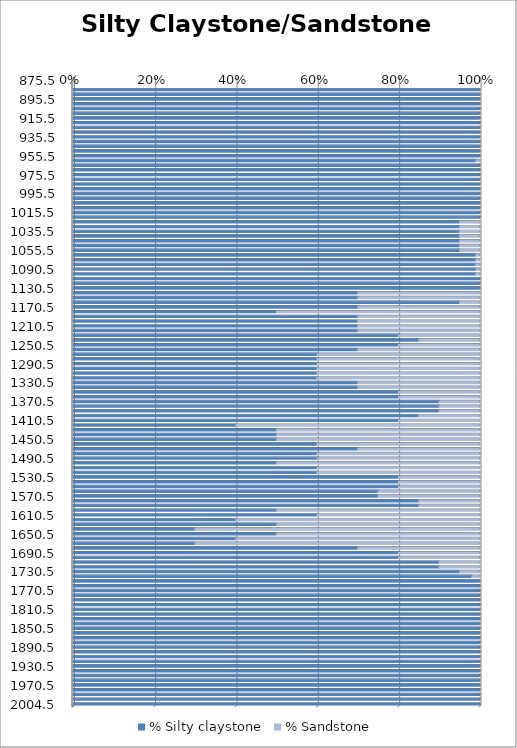
| Category | % Silty claystone | % Sandstone |
|---|---|---|
| 875.5 | 0 | 0 |
| 880.5 | 0 | 0 |
| 885.5 | 1 | 0 |
| 890.5 | 5 | 0 |
| 895.5 | 20 | 0 |
| 900.5 | 5 | 0 |
| 905.5 | 5 | 0 |
| 910.5 | 15 | 0 |
| 915.5 | 5 | 0 |
| 920.5 | 30 | 0 |
| 925.5 | 30 | 0 |
| 930.5 | 65 | 0 |
| 935.5 | 60 | 0 |
| 940.5 | 85 | 0 |
| 945.5 | 80 | 0 |
| 950.5 | 80 | 0 |
| 955.5 | 99 | 0 |
| 960.5 | 99 | 1 |
| 965.5 | 100 | 0 |
| 970.5 | 100 | 0 |
| 975.5 | 100 | 0 |
| 980.5 | 100 | 0 |
| 985.5 | 100 | 0 |
| 990.5 | 100 | 0 |
| 995.5 | 100 | 0 |
| 1000.5 | 100 | 0 |
| 1005.5 | 100 | 0 |
| 1010.5 | 100 | 0 |
| 1015.5 | 100 | 0 |
| 1020.5 | 100 | 0 |
| 1025.5 | 95 | 5 |
| 1030.5 | 95 | 5 |
| 1035.5 | 95 | 5 |
| 1040.5 | 95 | 5 |
| 1045.5 | 95 | 5 |
| 1050.5 | 95 | 5 |
| 1055.5 | 95 | 5 |
| 1060.5 | 99 | 1 |
| 1070.5 | 99 | 1 |
| 1080.5 | 99 | 1 |
| 1090.5 | 99 | 1 |
| 1100.5 | 99 | 1 |
| 1110.5 | 100 | 0 |
| 1120.5 | 100 | 0 |
| 1130.5 | 100 | 0 |
| 1140.5 | 70 | 30 |
| 1150.5 | 70 | 30 |
| 1160.5 | 95 | 5 |
| 1170.5 | 70 | 30 |
| 1180.5 | 50 | 50 |
| 1190.5 | 70 | 30 |
| 1200.5 | 70 | 30 |
| 1210.5 | 70 | 30 |
| 1220.5 | 70 | 30 |
| 1230.5 | 80 | 20 |
| 1240.5 | 85 | 15 |
| 1250.5 | 80 | 20 |
| 1260.5 | 70 | 30 |
| 1270.5 | 60 | 40 |
| 1280.5 | 60 | 40 |
| 1290.5 | 60 | 40 |
| 1300.5 | 60 | 40 |
| 1310.5 | 60 | 40 |
| 1320.5 | 60 | 40 |
| 1330.5 | 70 | 30 |
| 1340.5 | 70 | 30 |
| 1350.5 | 80 | 20 |
| 1360.5 | 80 | 20 |
| 1370.5 | 90 | 10 |
| 1380.5 | 90 | 10 |
| 1390.5 | 90 | 10 |
| 1400.5 | 85 | 15 |
| 1410.5 | 80 | 20 |
| 1420.5 | 40 | 60 |
| 1430.5 | 50 | 50 |
| 1440.5 | 50 | 50 |
| 1450.5 | 50 | 50 |
| 1460.5 | 60 | 40 |
| 1470.5 | 70 | 30 |
| 1480.5 | 60 | 40 |
| 1490.5 | 60 | 40 |
| 1500.5 | 50 | 50 |
| 1510.5 | 60 | 40 |
| 1520.5 | 60 | 40 |
| 1530.5 | 80 | 20 |
| 1540.5 | 80 | 20 |
| 1550.5 | 80 | 20 |
| 1560.5 | 75 | 25 |
| 1570.5 | 75 | 25 |
| 1580.5 | 85 | 15 |
| 1590.5 | 85 | 15 |
| 1600.5 | 50 | 50 |
| 1610.5 | 60 | 40 |
| 1620.5 | 40 | 60 |
| 1630.5 | 50 | 50 |
| 1640.5 | 30 | 70 |
| 1650.5 | 50 | 50 |
| 1660.5 | 40 | 60 |
| 1670.5 | 30 | 70 |
| 1680.5 | 70 | 30 |
| 1690.5 | 80 | 20 |
| 1700.5 | 80 | 20 |
| 1710.5 | 90 | 10 |
| 1720.5 | 90 | 10 |
| 1730.5 | 95 | 5 |
| 17410.5 | 98 | 2 |
| 1750.5 | 100 | 0 |
| 1760.5 | 100 | 0 |
| 1770.5 | 100 | 0 |
| 1780.5 | 100 | 0 |
| 1790.5 | 100 | 0 |
| 1800.5 | 100 | 0 |
| 1810.5 | 100 | 0 |
| 1820.5 | 100 | 0 |
| 1830.5 | 100 | 0 |
| 1840.5 | 100 | 0 |
| 1850.5 | 100 | 0 |
| 1860.5 | 100 | 0 |
| 1870.5 | 100 | 0 |
| 1880.5 | 100 | 0 |
| 1890.5 | 100 | 0 |
| 1900.5 | 100 | 0 |
| 1910.5 | 100 | 0 |
| 1920.5 | 100 | 0 |
| 1930.5 | 100 | 0 |
| 1940.5 | 100 | 0 |
| 1950.5 | 100 | 0 |
| 1960.5 | 100 | 0 |
| 1970.5 | 100 | 0 |
| 1980.5 | 100 | 0 |
| 1990.5 | 100 | 0 |
| 2000.5 | 100 | 0 |
| 2004.5 | 100 | 0 |